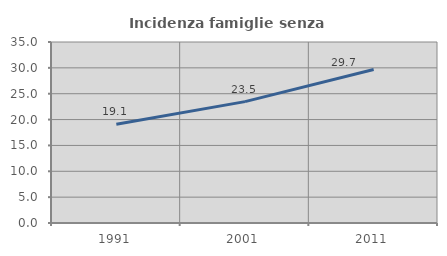
| Category | Incidenza famiglie senza nuclei |
|---|---|
| 1991.0 | 19.1 |
| 2001.0 | 23.47 |
| 2011.0 | 29.668 |